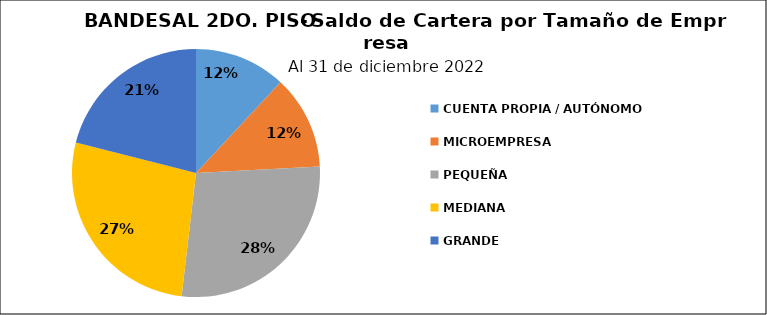
| Category | Saldo | Créditos |
|---|---|---|
| CUENTA PROPIA / AUTÓNOMO  | 50.503 | 4718 |
| MICROEMPRESA | 51.76 | 4113 |
| PEQUEÑA | 117.25 | 2456 |
| MEDIANA | 114.785 | 1274 |
| GRANDE | 89.033 | 211 |